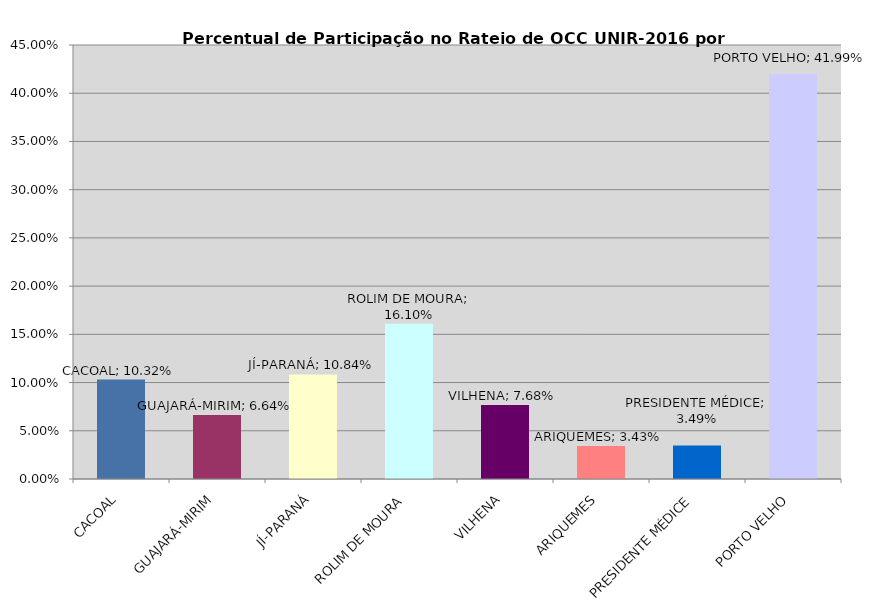
| Category | %PART |
|---|---|
| CACOAL | 0.103 |
| GUAJARÁ-MIRIM | 0.066 |
| JÍ-PARANÁ | 0.108 |
| ROLIM DE MOURA | 0.161 |
| VILHENA | 0.077 |
| ARIQUEMES | 0.034 |
| PRESIDENTE MÉDICE | 0.035 |
| PORTO VELHO | 0.42 |